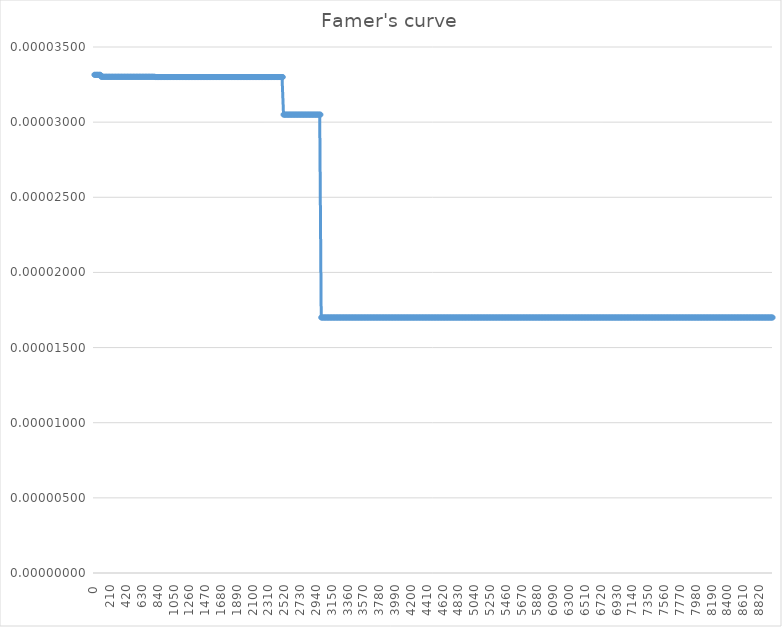
| Category | Cumulative frequency |
|---|---|
| 0.0 | 0 |
| 10.0 | 0 |
| 20.0 | 0 |
| 30.0 | 0 |
| 40.0 | 0 |
| 50.0 | 0 |
| 60.0 | 0 |
| 70.0 | 0 |
| 80.0 | 0 |
| 90.0 | 0 |
| 100.0 | 0 |
| 110.0 | 0 |
| 120.0 | 0 |
| 130.0 | 0 |
| 140.0 | 0 |
| 150.0 | 0 |
| 160.0 | 0 |
| 170.0 | 0 |
| 180.0 | 0 |
| 190.0 | 0 |
| 200.0 | 0 |
| 210.0 | 0 |
| 220.0 | 0 |
| 230.0 | 0 |
| 240.0 | 0 |
| 250.0 | 0 |
| 260.0 | 0 |
| 270.0 | 0 |
| 280.0 | 0 |
| 290.0 | 0 |
| 300.0 | 0 |
| 310.0 | 0 |
| 320.0 | 0 |
| 330.0 | 0 |
| 340.0 | 0 |
| 350.0 | 0 |
| 360.0 | 0 |
| 370.0 | 0 |
| 380.0 | 0 |
| 390.0 | 0 |
| 400.0 | 0 |
| 410.0 | 0 |
| 420.0 | 0 |
| 430.0 | 0 |
| 440.0 | 0 |
| 450.0 | 0 |
| 460.0 | 0 |
| 470.0 | 0 |
| 480.0 | 0 |
| 490.0 | 0 |
| 500.0 | 0 |
| 510.0 | 0 |
| 520.0 | 0 |
| 530.0 | 0 |
| 540.0 | 0 |
| 550.0 | 0 |
| 560.0 | 0 |
| 570.0 | 0 |
| 580.0 | 0 |
| 590.0 | 0 |
| 600.0 | 0 |
| 610.0 | 0 |
| 620.0 | 0 |
| 630.0 | 0 |
| 640.0 | 0 |
| 650.0 | 0 |
| 660.0 | 0 |
| 670.0 | 0 |
| 680.0 | 0 |
| 690.0 | 0 |
| 700.0 | 0 |
| 710.0 | 0 |
| 720.0 | 0 |
| 730.0 | 0 |
| 740.0 | 0 |
| 750.0 | 0 |
| 760.0 | 0 |
| 770.0 | 0 |
| 780.0 | 0 |
| 790.0 | 0 |
| 800.0 | 0 |
| 810.0 | 0 |
| 820.0 | 0 |
| 830.0 | 0 |
| 840.0 | 0 |
| 850.0 | 0 |
| 860.0 | 0 |
| 870.0 | 0 |
| 880.0 | 0 |
| 890.0 | 0 |
| 900.0 | 0 |
| 910.0 | 0 |
| 920.0 | 0 |
| 930.0 | 0 |
| 940.0 | 0 |
| 950.0 | 0 |
| 960.0 | 0 |
| 970.0 | 0 |
| 980.0 | 0 |
| 990.0 | 0 |
| 1000.0 | 0 |
| 1010.0 | 0 |
| 1020.0 | 0 |
| 1030.0 | 0 |
| 1040.0 | 0 |
| 1050.0 | 0 |
| 1060.0 | 0 |
| 1070.0 | 0 |
| 1080.0 | 0 |
| 1090.0 | 0 |
| 1100.0 | 0 |
| 1110.0 | 0 |
| 1120.0 | 0 |
| 1130.0 | 0 |
| 1140.0 | 0 |
| 1150.0 | 0 |
| 1160.0 | 0 |
| 1170.0 | 0 |
| 1180.0 | 0 |
| 1190.0 | 0 |
| 1200.0 | 0 |
| 1210.0 | 0 |
| 1220.0 | 0 |
| 1230.0 | 0 |
| 1240.0 | 0 |
| 1250.0 | 0 |
| 1260.0 | 0 |
| 1270.0 | 0 |
| 1280.0 | 0 |
| 1290.0 | 0 |
| 1300.0 | 0 |
| 1310.0 | 0 |
| 1320.0 | 0 |
| 1330.0 | 0 |
| 1340.0 | 0 |
| 1350.0 | 0 |
| 1360.0 | 0 |
| 1370.0 | 0 |
| 1380.0 | 0 |
| 1390.0 | 0 |
| 1400.0 | 0 |
| 1410.0 | 0 |
| 1420.0 | 0 |
| 1430.0 | 0 |
| 1440.0 | 0 |
| 1450.0 | 0 |
| 1460.0 | 0 |
| 1470.0 | 0 |
| 1480.0 | 0 |
| 1490.0 | 0 |
| 1500.0 | 0 |
| 1510.0 | 0 |
| 1520.0 | 0 |
| 1530.0 | 0 |
| 1540.0 | 0 |
| 1550.0 | 0 |
| 1560.0 | 0 |
| 1570.0 | 0 |
| 1580.0 | 0 |
| 1590.0 | 0 |
| 1600.0 | 0 |
| 1610.0 | 0 |
| 1620.0 | 0 |
| 1630.0 | 0 |
| 1640.0 | 0 |
| 1650.0 | 0 |
| 1660.0 | 0 |
| 1670.0 | 0 |
| 1680.0 | 0 |
| 1690.0 | 0 |
| 1700.0 | 0 |
| 1710.0 | 0 |
| 1720.0 | 0 |
| 1730.0 | 0 |
| 1740.0 | 0 |
| 1750.0 | 0 |
| 1760.0 | 0 |
| 1770.0 | 0 |
| 1780.0 | 0 |
| 1790.0 | 0 |
| 1800.0 | 0 |
| 1810.0 | 0 |
| 1820.0 | 0 |
| 1830.0 | 0 |
| 1840.0 | 0 |
| 1850.0 | 0 |
| 1860.0 | 0 |
| 1870.0 | 0 |
| 1880.0 | 0 |
| 1890.0 | 0 |
| 1900.0 | 0 |
| 1910.0 | 0 |
| 1920.0 | 0 |
| 1930.0 | 0 |
| 1940.0 | 0 |
| 1950.0 | 0 |
| 1960.0 | 0 |
| 1970.0 | 0 |
| 1980.0 | 0 |
| 1990.0 | 0 |
| 2000.0 | 0 |
| 2010.0 | 0 |
| 2020.0 | 0 |
| 2030.0 | 0 |
| 2040.0 | 0 |
| 2050.0 | 0 |
| 2060.0 | 0 |
| 2070.0 | 0 |
| 2080.0 | 0 |
| 2090.0 | 0 |
| 2100.0 | 0 |
| 2110.0 | 0 |
| 2120.0 | 0 |
| 2130.0 | 0 |
| 2140.0 | 0 |
| 2150.0 | 0 |
| 2160.0 | 0 |
| 2170.0 | 0 |
| 2180.0 | 0 |
| 2190.0 | 0 |
| 2200.0 | 0 |
| 2210.0 | 0 |
| 2220.0 | 0 |
| 2230.0 | 0 |
| 2240.0 | 0 |
| 2250.0 | 0 |
| 2260.0 | 0 |
| 2270.0 | 0 |
| 2280.0 | 0 |
| 2290.0 | 0 |
| 2300.0 | 0 |
| 2310.0 | 0 |
| 2320.0 | 0 |
| 2330.0 | 0 |
| 2340.0 | 0 |
| 2350.0 | 0 |
| 2360.0 | 0 |
| 2370.0 | 0 |
| 2380.0 | 0 |
| 2390.0 | 0 |
| 2400.0 | 0 |
| 2410.0 | 0 |
| 2420.0 | 0 |
| 2430.0 | 0 |
| 2440.0 | 0 |
| 2450.0 | 0 |
| 2460.0 | 0 |
| 2470.0 | 0 |
| 2480.0 | 0 |
| 2490.0 | 0 |
| 2500.0 | 0 |
| 2510.0 | 0 |
| 2520.0 | 0 |
| 2530.0 | 0 |
| 2540.0 | 0 |
| 2550.0 | 0 |
| 2560.0 | 0 |
| 2570.0 | 0 |
| 2580.0 | 0 |
| 2590.0 | 0 |
| 2600.0 | 0 |
| 2610.0 | 0 |
| 2620.0 | 0 |
| 2630.0 | 0 |
| 2640.0 | 0 |
| 2650.0 | 0 |
| 2660.0 | 0 |
| 2670.0 | 0 |
| 2680.0 | 0 |
| 2690.0 | 0 |
| 2700.0 | 0 |
| 2710.0 | 0 |
| 2720.0 | 0 |
| 2730.0 | 0 |
| 2740.0 | 0 |
| 2750.0 | 0 |
| 2760.0 | 0 |
| 2770.0 | 0 |
| 2780.0 | 0 |
| 2790.0 | 0 |
| 2800.0 | 0 |
| 2810.0 | 0 |
| 2820.0 | 0 |
| 2830.0 | 0 |
| 2840.0 | 0 |
| 2850.0 | 0 |
| 2860.0 | 0 |
| 2870.0 | 0 |
| 2880.0 | 0 |
| 2890.0 | 0 |
| 2900.0 | 0 |
| 2910.0 | 0 |
| 2920.0 | 0 |
| 2930.0 | 0 |
| 2940.0 | 0 |
| 2950.0 | 0 |
| 2960.0 | 0 |
| 2970.0 | 0 |
| 2980.0 | 0 |
| 2990.0 | 0 |
| 3000.0 | 0 |
| 3010.0 | 0 |
| 3020.0 | 0 |
| 3030.0 | 0 |
| 3040.0 | 0 |
| 3050.0 | 0 |
| 3060.0 | 0 |
| 3070.0 | 0 |
| 3080.0 | 0 |
| 3090.0 | 0 |
| 3100.0 | 0 |
| 3110.0 | 0 |
| 3120.0 | 0 |
| 3130.0 | 0 |
| 3140.0 | 0 |
| 3150.0 | 0 |
| 3160.0 | 0 |
| 3170.0 | 0 |
| 3180.0 | 0 |
| 3190.0 | 0 |
| 3200.0 | 0 |
| 3210.0 | 0 |
| 3220.0 | 0 |
| 3230.0 | 0 |
| 3240.0 | 0 |
| 3250.0 | 0 |
| 3260.0 | 0 |
| 3270.0 | 0 |
| 3280.0 | 0 |
| 3290.0 | 0 |
| 3300.0 | 0 |
| 3310.0 | 0 |
| 3320.0 | 0 |
| 3330.0 | 0 |
| 3340.0 | 0 |
| 3350.0 | 0 |
| 3360.0 | 0 |
| 3370.0 | 0 |
| 3380.0 | 0 |
| 3390.0 | 0 |
| 3400.0 | 0 |
| 3410.0 | 0 |
| 3420.0 | 0 |
| 3430.0 | 0 |
| 3440.0 | 0 |
| 3450.0 | 0 |
| 3460.0 | 0 |
| 3470.0 | 0 |
| 3480.0 | 0 |
| 3490.0 | 0 |
| 3500.0 | 0 |
| 3510.0 | 0 |
| 3520.0 | 0 |
| 3530.0 | 0 |
| 3540.0 | 0 |
| 3550.0 | 0 |
| 3560.0 | 0 |
| 3570.0 | 0 |
| 3580.0 | 0 |
| 3590.0 | 0 |
| 3600.0 | 0 |
| 3610.0 | 0 |
| 3620.0 | 0 |
| 3630.0 | 0 |
| 3640.0 | 0 |
| 3650.0 | 0 |
| 3660.0 | 0 |
| 3670.0 | 0 |
| 3680.0 | 0 |
| 3690.0 | 0 |
| 3700.0 | 0 |
| 3710.0 | 0 |
| 3720.0 | 0 |
| 3730.0 | 0 |
| 3740.0 | 0 |
| 3750.0 | 0 |
| 3760.0 | 0 |
| 3770.0 | 0 |
| 3780.0 | 0 |
| 3790.0 | 0 |
| 3800.0 | 0 |
| 3810.0 | 0 |
| 3820.0 | 0 |
| 3830.0 | 0 |
| 3840.0 | 0 |
| 3850.0 | 0 |
| 3860.0 | 0 |
| 3870.0 | 0 |
| 3880.0 | 0 |
| 3890.0 | 0 |
| 3900.0 | 0 |
| 3910.0 | 0 |
| 3920.0 | 0 |
| 3930.0 | 0 |
| 3940.0 | 0 |
| 3950.0 | 0 |
| 3960.0 | 0 |
| 3970.0 | 0 |
| 3980.0 | 0 |
| 3990.0 | 0 |
| 4000.0 | 0 |
| 4010.0 | 0 |
| 4020.0 | 0 |
| 4030.0 | 0 |
| 4040.0 | 0 |
| 4050.0 | 0 |
| 4060.0 | 0 |
| 4070.0 | 0 |
| 4080.0 | 0 |
| 4090.0 | 0 |
| 4100.0 | 0 |
| 4110.0 | 0 |
| 4120.0 | 0 |
| 4130.0 | 0 |
| 4140.0 | 0 |
| 4150.0 | 0 |
| 4160.0 | 0 |
| 4170.0 | 0 |
| 4180.0 | 0 |
| 4190.0 | 0 |
| 4200.0 | 0 |
| 4210.0 | 0 |
| 4220.0 | 0 |
| 4230.0 | 0 |
| 4240.0 | 0 |
| 4250.0 | 0 |
| 4260.0 | 0 |
| 4270.0 | 0 |
| 4280.0 | 0 |
| 4290.0 | 0 |
| 4300.0 | 0 |
| 4310.0 | 0 |
| 4320.0 | 0 |
| 4330.0 | 0 |
| 4340.0 | 0 |
| 4350.0 | 0 |
| 4360.0 | 0 |
| 4370.0 | 0 |
| 4380.0 | 0 |
| 4390.0 | 0 |
| 4400.0 | 0 |
| 4410.0 | 0 |
| 4420.0 | 0 |
| 4430.0 | 0 |
| 4440.0 | 0 |
| 4450.0 | 0 |
| 4460.0 | 0 |
| 4470.0 | 0 |
| 4480.0 | 0 |
| 4490.0 | 0 |
| 4500.0 | 0 |
| 4510.0 | 0 |
| 4520.0 | 0 |
| 4530.0 | 0 |
| 4540.0 | 0 |
| 4550.0 | 0 |
| 4560.0 | 0 |
| 4570.0 | 0 |
| 4580.0 | 0 |
| 4590.0 | 0 |
| 4600.0 | 0 |
| 4610.0 | 0 |
| 4620.0 | 0 |
| 4630.0 | 0 |
| 4640.0 | 0 |
| 4650.0 | 0 |
| 4660.0 | 0 |
| 4670.0 | 0 |
| 4680.0 | 0 |
| 4690.0 | 0 |
| 4700.0 | 0 |
| 4710.0 | 0 |
| 4720.0 | 0 |
| 4730.0 | 0 |
| 4740.0 | 0 |
| 4750.0 | 0 |
| 4760.0 | 0 |
| 4770.0 | 0 |
| 4780.0 | 0 |
| 4790.0 | 0 |
| 4800.0 | 0 |
| 4810.0 | 0 |
| 4820.0 | 0 |
| 4830.0 | 0 |
| 4840.0 | 0 |
| 4850.0 | 0 |
| 4860.0 | 0 |
| 4870.0 | 0 |
| 4880.0 | 0 |
| 4890.0 | 0 |
| 4900.0 | 0 |
| 4910.0 | 0 |
| 4920.0 | 0 |
| 4930.0 | 0 |
| 4940.0 | 0 |
| 4950.0 | 0 |
| 4960.0 | 0 |
| 4970.0 | 0 |
| 4980.0 | 0 |
| 4990.0 | 0 |
| 5000.0 | 0 |
| 5010.0 | 0 |
| 5020.0 | 0 |
| 5030.0 | 0 |
| 5040.0 | 0 |
| 5050.0 | 0 |
| 5060.0 | 0 |
| 5070.0 | 0 |
| 5080.0 | 0 |
| 5090.0 | 0 |
| 5100.0 | 0 |
| 5110.0 | 0 |
| 5120.0 | 0 |
| 5130.0 | 0 |
| 5140.0 | 0 |
| 5150.0 | 0 |
| 5160.0 | 0 |
| 5170.0 | 0 |
| 5180.0 | 0 |
| 5190.0 | 0 |
| 5200.0 | 0 |
| 5210.0 | 0 |
| 5220.0 | 0 |
| 5230.0 | 0 |
| 5240.0 | 0 |
| 5250.0 | 0 |
| 5260.0 | 0 |
| 5270.0 | 0 |
| 5280.0 | 0 |
| 5290.0 | 0 |
| 5300.0 | 0 |
| 5310.0 | 0 |
| 5320.0 | 0 |
| 5330.0 | 0 |
| 5340.0 | 0 |
| 5350.0 | 0 |
| 5360.0 | 0 |
| 5370.0 | 0 |
| 5380.0 | 0 |
| 5390.0 | 0 |
| 5400.0 | 0 |
| 5410.0 | 0 |
| 5420.0 | 0 |
| 5430.0 | 0 |
| 5440.0 | 0 |
| 5450.0 | 0 |
| 5460.0 | 0 |
| 5470.0 | 0 |
| 5480.0 | 0 |
| 5490.0 | 0 |
| 5500.0 | 0 |
| 5510.0 | 0 |
| 5520.0 | 0 |
| 5530.0 | 0 |
| 5540.0 | 0 |
| 5550.0 | 0 |
| 5560.0 | 0 |
| 5570.0 | 0 |
| 5580.0 | 0 |
| 5590.0 | 0 |
| 5600.0 | 0 |
| 5610.0 | 0 |
| 5620.0 | 0 |
| 5630.0 | 0 |
| 5640.0 | 0 |
| 5650.0 | 0 |
| 5660.0 | 0 |
| 5670.0 | 0 |
| 5680.0 | 0 |
| 5690.0 | 0 |
| 5700.0 | 0 |
| 5710.0 | 0 |
| 5720.0 | 0 |
| 5730.0 | 0 |
| 5740.0 | 0 |
| 5750.0 | 0 |
| 5760.0 | 0 |
| 5770.0 | 0 |
| 5780.0 | 0 |
| 5790.0 | 0 |
| 5800.0 | 0 |
| 5810.0 | 0 |
| 5820.0 | 0 |
| 5830.0 | 0 |
| 5840.0 | 0 |
| 5850.0 | 0 |
| 5860.0 | 0 |
| 5870.0 | 0 |
| 5880.0 | 0 |
| 5890.0 | 0 |
| 5900.0 | 0 |
| 5910.0 | 0 |
| 5920.0 | 0 |
| 5930.0 | 0 |
| 5940.0 | 0 |
| 5950.0 | 0 |
| 5960.0 | 0 |
| 5970.0 | 0 |
| 5980.0 | 0 |
| 5990.0 | 0 |
| 6000.0 | 0 |
| 6010.0 | 0 |
| 6020.0 | 0 |
| 6030.0 | 0 |
| 6040.0 | 0 |
| 6050.0 | 0 |
| 6060.0 | 0 |
| 6070.0 | 0 |
| 6080.0 | 0 |
| 6090.0 | 0 |
| 6100.0 | 0 |
| 6110.0 | 0 |
| 6120.0 | 0 |
| 6130.0 | 0 |
| 6140.0 | 0 |
| 6150.0 | 0 |
| 6160.0 | 0 |
| 6170.0 | 0 |
| 6180.0 | 0 |
| 6190.0 | 0 |
| 6200.0 | 0 |
| 6210.0 | 0 |
| 6220.0 | 0 |
| 6230.0 | 0 |
| 6240.0 | 0 |
| 6250.0 | 0 |
| 6260.0 | 0 |
| 6270.0 | 0 |
| 6280.0 | 0 |
| 6290.0 | 0 |
| 6300.0 | 0 |
| 6310.0 | 0 |
| 6320.0 | 0 |
| 6330.0 | 0 |
| 6340.0 | 0 |
| 6350.0 | 0 |
| 6360.0 | 0 |
| 6370.0 | 0 |
| 6380.0 | 0 |
| 6390.0 | 0 |
| 6400.0 | 0 |
| 6410.0 | 0 |
| 6420.0 | 0 |
| 6430.0 | 0 |
| 6440.0 | 0 |
| 6450.0 | 0 |
| 6460.0 | 0 |
| 6470.0 | 0 |
| 6480.0 | 0 |
| 6490.0 | 0 |
| 6500.0 | 0 |
| 6510.0 | 0 |
| 6520.0 | 0 |
| 6530.0 | 0 |
| 6540.0 | 0 |
| 6550.0 | 0 |
| 6560.0 | 0 |
| 6570.0 | 0 |
| 6580.0 | 0 |
| 6590.0 | 0 |
| 6600.0 | 0 |
| 6610.0 | 0 |
| 6620.0 | 0 |
| 6630.0 | 0 |
| 6640.0 | 0 |
| 6650.0 | 0 |
| 6660.0 | 0 |
| 6670.0 | 0 |
| 6680.0 | 0 |
| 6690.0 | 0 |
| 6700.0 | 0 |
| 6710.0 | 0 |
| 6720.0 | 0 |
| 6730.0 | 0 |
| 6740.0 | 0 |
| 6750.0 | 0 |
| 6760.0 | 0 |
| 6770.0 | 0 |
| 6780.0 | 0 |
| 6790.0 | 0 |
| 6800.0 | 0 |
| 6810.0 | 0 |
| 6820.0 | 0 |
| 6830.0 | 0 |
| 6840.0 | 0 |
| 6850.0 | 0 |
| 6860.0 | 0 |
| 6870.0 | 0 |
| 6880.0 | 0 |
| 6890.0 | 0 |
| 6900.0 | 0 |
| 6910.0 | 0 |
| 6920.0 | 0 |
| 6930.0 | 0 |
| 6940.0 | 0 |
| 6950.0 | 0 |
| 6960.0 | 0 |
| 6970.0 | 0 |
| 6980.0 | 0 |
| 6990.0 | 0 |
| 7000.0 | 0 |
| 7010.0 | 0 |
| 7020.0 | 0 |
| 7030.0 | 0 |
| 7040.0 | 0 |
| 7050.0 | 0 |
| 7060.0 | 0 |
| 7070.0 | 0 |
| 7080.0 | 0 |
| 7090.0 | 0 |
| 7100.0 | 0 |
| 7110.0 | 0 |
| 7120.0 | 0 |
| 7130.0 | 0 |
| 7140.0 | 0 |
| 7150.0 | 0 |
| 7160.0 | 0 |
| 7170.0 | 0 |
| 7180.0 | 0 |
| 7190.0 | 0 |
| 7200.0 | 0 |
| 7210.0 | 0 |
| 7220.0 | 0 |
| 7230.0 | 0 |
| 7240.0 | 0 |
| 7250.0 | 0 |
| 7260.0 | 0 |
| 7270.0 | 0 |
| 7280.0 | 0 |
| 7290.0 | 0 |
| 7300.0 | 0 |
| 7310.0 | 0 |
| 7320.0 | 0 |
| 7330.0 | 0 |
| 7340.0 | 0 |
| 7350.0 | 0 |
| 7360.0 | 0 |
| 7370.0 | 0 |
| 7380.0 | 0 |
| 7390.0 | 0 |
| 7400.0 | 0 |
| 7410.0 | 0 |
| 7420.0 | 0 |
| 7430.0 | 0 |
| 7440.0 | 0 |
| 7450.0 | 0 |
| 7460.0 | 0 |
| 7470.0 | 0 |
| 7480.0 | 0 |
| 7490.0 | 0 |
| 7500.0 | 0 |
| 7510.0 | 0 |
| 7520.0 | 0 |
| 7530.0 | 0 |
| 7540.0 | 0 |
| 7550.0 | 0 |
| 7560.0 | 0 |
| 7570.0 | 0 |
| 7580.0 | 0 |
| 7590.0 | 0 |
| 7600.0 | 0 |
| 7610.0 | 0 |
| 7620.0 | 0 |
| 7630.0 | 0 |
| 7640.0 | 0 |
| 7650.0 | 0 |
| 7660.0 | 0 |
| 7670.0 | 0 |
| 7680.0 | 0 |
| 7690.0 | 0 |
| 7700.0 | 0 |
| 7710.0 | 0 |
| 7720.0 | 0 |
| 7730.0 | 0 |
| 7740.0 | 0 |
| 7750.0 | 0 |
| 7760.0 | 0 |
| 7770.0 | 0 |
| 7780.0 | 0 |
| 7790.0 | 0 |
| 7800.0 | 0 |
| 7810.0 | 0 |
| 7820.0 | 0 |
| 7830.0 | 0 |
| 7840.0 | 0 |
| 7850.0 | 0 |
| 7860.0 | 0 |
| 7870.0 | 0 |
| 7880.0 | 0 |
| 7890.0 | 0 |
| 7900.0 | 0 |
| 7910.0 | 0 |
| 7920.0 | 0 |
| 7930.0 | 0 |
| 7940.0 | 0 |
| 7950.0 | 0 |
| 7960.0 | 0 |
| 7970.0 | 0 |
| 7980.0 | 0 |
| 7990.0 | 0 |
| 8000.0 | 0 |
| 8010.0 | 0 |
| 8020.0 | 0 |
| 8030.0 | 0 |
| 8040.0 | 0 |
| 8050.0 | 0 |
| 8060.0 | 0 |
| 8070.0 | 0 |
| 8080.0 | 0 |
| 8090.0 | 0 |
| 8100.0 | 0 |
| 8110.0 | 0 |
| 8120.0 | 0 |
| 8130.0 | 0 |
| 8140.0 | 0 |
| 8150.0 | 0 |
| 8160.0 | 0 |
| 8170.0 | 0 |
| 8180.0 | 0 |
| 8190.0 | 0 |
| 8200.0 | 0 |
| 8210.0 | 0 |
| 8220.0 | 0 |
| 8230.0 | 0 |
| 8240.0 | 0 |
| 8250.0 | 0 |
| 8260.0 | 0 |
| 8270.0 | 0 |
| 8280.0 | 0 |
| 8290.0 | 0 |
| 8300.0 | 0 |
| 8310.0 | 0 |
| 8320.0 | 0 |
| 8330.0 | 0 |
| 8340.0 | 0 |
| 8350.0 | 0 |
| 8360.0 | 0 |
| 8370.0 | 0 |
| 8380.0 | 0 |
| 8390.0 | 0 |
| 8400.0 | 0 |
| 8410.0 | 0 |
| 8420.0 | 0 |
| 8430.0 | 0 |
| 8440.0 | 0 |
| 8450.0 | 0 |
| 8460.0 | 0 |
| 8470.0 | 0 |
| 8480.0 | 0 |
| 8490.0 | 0 |
| 8500.0 | 0 |
| 8510.0 | 0 |
| 8520.0 | 0 |
| 8530.0 | 0 |
| 8540.0 | 0 |
| 8550.0 | 0 |
| 8560.0 | 0 |
| 8570.0 | 0 |
| 8580.0 | 0 |
| 8590.0 | 0 |
| 8600.0 | 0 |
| 8610.0 | 0 |
| 8620.0 | 0 |
| 8630.0 | 0 |
| 8640.0 | 0 |
| 8650.0 | 0 |
| 8660.0 | 0 |
| 8670.0 | 0 |
| 8680.0 | 0 |
| 8690.0 | 0 |
| 8700.0 | 0 |
| 8710.0 | 0 |
| 8720.0 | 0 |
| 8730.0 | 0 |
| 8740.0 | 0 |
| 8750.0 | 0 |
| 8760.0 | 0 |
| 8770.0 | 0 |
| 8780.0 | 0 |
| 8790.0 | 0 |
| 8800.0 | 0 |
| 8810.0 | 0 |
| 8820.0 | 0 |
| 8830.0 | 0 |
| 8840.0 | 0 |
| 8850.0 | 0 |
| 8860.0 | 0 |
| 8870.0 | 0 |
| 8880.0 | 0 |
| 8890.0 | 0 |
| 8900.0 | 0 |
| 8910.0 | 0 |
| 8920.0 | 0 |
| 8930.0 | 0 |
| 8940.0 | 0 |
| 8950.0 | 0 |
| 8960.0 | 0 |
| 8970.0 | 0 |
| 8980.0 | 0 |
| 8990.0 | 0 |
| 9000.0 | 0 |